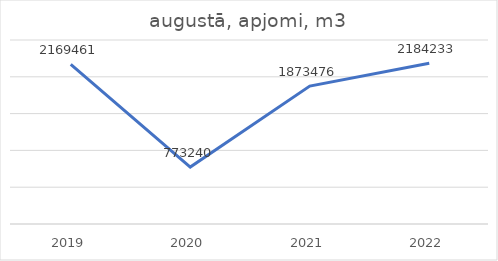
| Category | augustā, apjomi, m3 |
|---|---|
| 2019.0 | 2169461 |
| 2020.0 | 773240 |
| 2021.0 | 1873476 |
| 2022.0 | 2184233 |